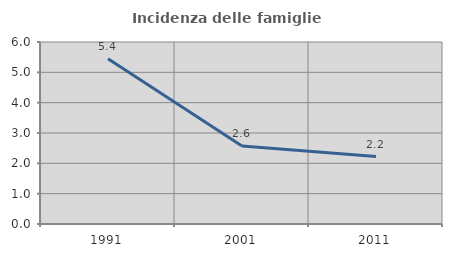
| Category | Incidenza delle famiglie numerose |
|---|---|
| 1991.0 | 5.45 |
| 2001.0 | 2.574 |
| 2011.0 | 2.222 |